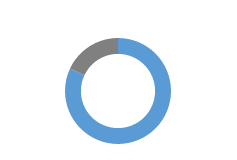
| Category | Series 0 |
|---|---|
| 0 | 0.82 |
| 1 | 0.18 |